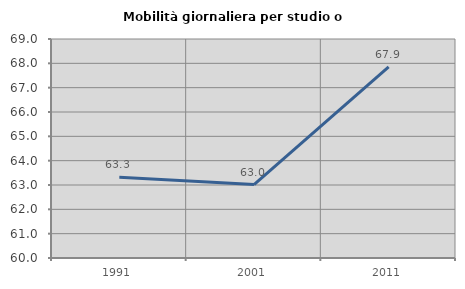
| Category | Mobilità giornaliera per studio o lavoro |
|---|---|
| 1991.0 | 63.321 |
| 2001.0 | 63.016 |
| 2011.0 | 67.855 |